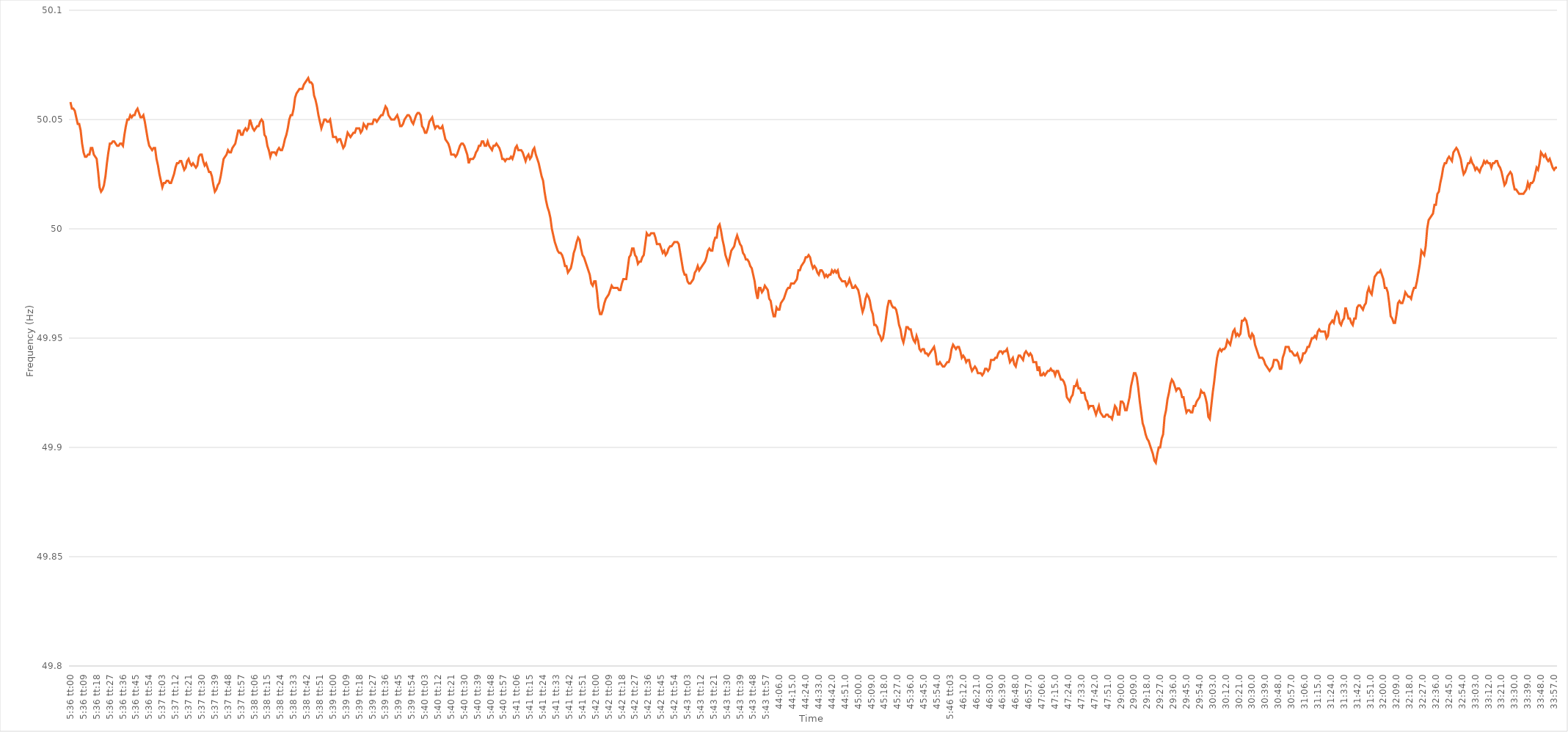
| Category | Series 0 |
|---|---|
| 0.2333333333333333 | 50.058 |
| 0.2333449074074074 | 50.055 |
| 0.23335648148148147 | 50.055 |
| 0.23336805555555554 | 50.054 |
| 0.23337962962962963 | 50.051 |
| 0.2333912037037037 | 50.048 |
| 0.23340277777777776 | 50.048 |
| 0.23341435185185186 | 50.045 |
| 0.23342592592592593 | 50.039 |
| 0.2334375 | 50.035 |
| 0.2334490740740741 | 50.033 |
| 0.23346064814814815 | 50.033 |
| 0.23347222222222222 | 50.034 |
| 0.23348379629629631 | 50.034 |
| 0.23349537037037038 | 50.037 |
| 0.23350694444444445 | 50.037 |
| 0.23351851851851854 | 50.034 |
| 0.23353009259259258 | 50.033 |
| 0.23354166666666668 | 50.032 |
| 0.23355324074074071 | 50.026 |
| 0.23356481481481484 | 50.019 |
| 0.23357638888888888 | 50.017 |
| 0.23358796296296294 | 50.018 |
| 0.23359953703703704 | 50.02 |
| 0.2336111111111111 | 50.024 |
| 0.23362268518518517 | 50.03 |
| 0.23363425925925926 | 50.035 |
| 0.23364583333333333 | 50.039 |
| 0.2336574074074074 | 50.039 |
| 0.2336689814814815 | 50.04 |
| 0.23368055555555556 | 50.04 |
| 0.23369212962962962 | 50.039 |
| 0.23370370370370372 | 50.038 |
| 0.23371527777777779 | 50.038 |
| 0.23372685185185185 | 50.039 |
| 0.23373842592592595 | 50.039 |
| 0.23375 | 50.038 |
| 0.23376157407407408 | 50.043 |
| 0.23377314814814812 | 50.047 |
| 0.23378472222222224 | 50.05 |
| 0.23379629629629628 | 50.05 |
| 0.23380787037037035 | 50.052 |
| 0.23381944444444444 | 50.051 |
| 0.2338310185185185 | 50.052 |
| 0.23384259259259257 | 50.052 |
| 0.23385416666666667 | 50.054 |
| 0.23386574074074074 | 50.055 |
| 0.2338773148148148 | 50.053 |
| 0.2338888888888889 | 50.051 |
| 0.23390046296296296 | 50.051 |
| 0.23391203703703703 | 50.052 |
| 0.23392361111111112 | 50.049 |
| 0.2339351851851852 | 50.045 |
| 0.23394675925925926 | 50.041 |
| 0.23395833333333335 | 50.038 |
| 0.23396990740740742 | 50.037 |
| 0.23398148148148148 | 50.036 |
| 0.23399305555555558 | 50.037 |
| 0.23400462962962965 | 50.037 |
| 0.23401620370370368 | 50.032 |
| 0.2340277777777778 | 50.029 |
| 0.23403935185185185 | 50.025 |
| 0.2340509259259259 | 50.022 |
| 0.23406249999999998 | 50.019 |
| 0.23407407407407407 | 50.021 |
| 0.23408564814814814 | 50.021 |
| 0.2340972222222222 | 50.022 |
| 0.2341087962962963 | 50.022 |
| 0.23412037037037037 | 50.021 |
| 0.23413194444444443 | 50.021 |
| 0.23414351851851853 | 50.023 |
| 0.2341550925925926 | 50.025 |
| 0.23416666666666666 | 50.028 |
| 0.23417824074074076 | 50.03 |
| 0.23418981481481482 | 50.03 |
| 0.2342013888888889 | 50.031 |
| 0.23421296296296298 | 50.031 |
| 0.23422453703703705 | 50.029 |
| 0.2342361111111111 | 50.027 |
| 0.2342476851851852 | 50.028 |
| 0.23425925925925925 | 50.031 |
| 0.23427083333333334 | 50.032 |
| 0.23428240740740738 | 50.03 |
| 0.23429398148148148 | 50.029 |
| 0.23430555555555554 | 50.03 |
| 0.2343171296296296 | 50.029 |
| 0.2343287037037037 | 50.028 |
| 0.23434027777777777 | 50.029 |
| 0.23435185185185184 | 50.033 |
| 0.23436342592592593 | 50.034 |
| 0.234375 | 50.034 |
| 0.23438657407407407 | 50.031 |
| 0.23439814814814816 | 50.029 |
| 0.23440972222222223 | 50.03 |
| 0.2344212962962963 | 50.028 |
| 0.2344328703703704 | 50.026 |
| 0.23444444444444446 | 50.026 |
| 0.23445601851851852 | 50.024 |
| 0.23446759259259262 | 50.02 |
| 0.23447916666666666 | 50.017 |
| 0.23449074074074075 | 50.018 |
| 0.2345023148148148 | 50.02 |
| 0.2345138888888889 | 50.021 |
| 0.23452546296296295 | 50.024 |
| 0.23453703703703702 | 50.028 |
| 0.2345486111111111 | 50.032 |
| 0.23456018518518518 | 50.033 |
| 0.23457175925925924 | 50.034 |
| 0.23458333333333334 | 50.036 |
| 0.2345949074074074 | 50.035 |
| 0.23460648148148147 | 50.035 |
| 0.23461805555555557 | 50.037 |
| 0.23462962962962963 | 50.038 |
| 0.2346412037037037 | 50.039 |
| 0.2346527777777778 | 50.042 |
| 0.23466435185185186 | 50.045 |
| 0.23467592592592593 | 50.045 |
| 0.23468750000000002 | 50.043 |
| 0.2346990740740741 | 50.043 |
| 0.23471064814814815 | 50.045 |
| 0.2347222222222222 | 50.046 |
| 0.23473379629629632 | 50.045 |
| 0.23474537037037035 | 50.046 |
| 0.23475694444444442 | 50.05 |
| 0.23476851851851852 | 50.048 |
| 0.23478009259259258 | 50.046 |
| 0.23479166666666665 | 50.045 |
| 0.23480324074074074 | 50.046 |
| 0.2348148148148148 | 50.047 |
| 0.23482638888888888 | 50.047 |
| 0.23483796296296297 | 50.049 |
| 0.23484953703703704 | 50.05 |
| 0.2348611111111111 | 50.049 |
| 0.2348726851851852 | 50.043 |
| 0.23488425925925926 | 50.042 |
| 0.23489583333333333 | 50.038 |
| 0.23490740740740743 | 50.036 |
| 0.2349189814814815 | 50.033 |
| 0.23493055555555556 | 50.035 |
| 0.23494212962962965 | 50.035 |
| 0.23495370370370372 | 50.035 |
| 0.23496527777777776 | 50.034 |
| 0.23497685185185188 | 50.036 |
| 0.23498842592592592 | 50.037 |
| 0.235 | 50.036 |
| 0.23501157407407405 | 50.036 |
| 0.23502314814814815 | 50.038 |
| 0.23503472222222221 | 50.041 |
| 0.23504629629629628 | 50.043 |
| 0.23505787037037038 | 50.046 |
| 0.23506944444444444 | 50.05 |
| 0.2350810185185185 | 50.052 |
| 0.2350925925925926 | 50.052 |
| 0.23510416666666667 | 50.055 |
| 0.23511574074074074 | 50.06 |
| 0.23512731481481483 | 50.062 |
| 0.2351388888888889 | 50.063 |
| 0.23515046296296296 | 50.064 |
| 0.23516203703703706 | 50.064 |
| 0.23517361111111112 | 50.064 |
| 0.23518518518518516 | 50.066 |
| 0.23519675925925929 | 50.067 |
| 0.23520833333333332 | 50.068 |
| 0.23521990740740742 | 50.069 |
| 0.23523148148148146 | 50.067 |
| 0.23524305555555555 | 50.067 |
| 0.23525462962962962 | 50.066 |
| 0.23526620370370369 | 50.061 |
| 0.23527777777777778 | 50.059 |
| 0.23528935185185185 | 50.056 |
| 0.2353009259259259 | 50.052 |
| 0.2353125 | 50.049 |
| 0.23532407407407407 | 50.046 |
| 0.23533564814814814 | 50.048 |
| 0.23534722222222224 | 50.05 |
| 0.2353587962962963 | 50.05 |
| 0.23537037037037037 | 50.049 |
| 0.23538194444444446 | 50.049 |
| 0.23539351851851853 | 50.05 |
| 0.2354050925925926 | 50.046 |
| 0.2354166666666667 | 50.042 |
| 0.23542824074074073 | 50.042 |
| 0.23543981481481482 | 50.042 |
| 0.23545138888888886 | 50.04 |
| 0.23546296296296299 | 50.041 |
| 0.23547453703703702 | 50.041 |
| 0.2354861111111111 | 50.039 |
| 0.23549768518518518 | 50.037 |
| 0.23550925925925925 | 50.038 |
| 0.23552083333333332 | 50.041 |
| 0.2355324074074074 | 50.044 |
| 0.23554398148148148 | 50.043 |
| 0.23555555555555555 | 50.042 |
| 0.23556712962962964 | 50.043 |
| 0.2355787037037037 | 50.044 |
| 0.23559027777777777 | 50.044 |
| 0.23560185185185187 | 50.046 |
| 0.23561342592592593 | 50.046 |
| 0.235625 | 50.046 |
| 0.2356365740740741 | 50.044 |
| 0.23564814814814816 | 50.045 |
| 0.23565972222222223 | 50.048 |
| 0.23567129629629627 | 50.047 |
| 0.2356828703703704 | 50.046 |
| 0.23569444444444443 | 50.048 |
| 0.2357060185185185 | 50.048 |
| 0.2357175925925926 | 50.048 |
| 0.23572916666666666 | 50.048 |
| 0.23574074074074072 | 50.05 |
| 0.23575231481481482 | 50.05 |
| 0.23576388888888888 | 50.049 |
| 0.23577546296296295 | 50.05 |
| 0.23578703703703704 | 50.051 |
| 0.2357986111111111 | 50.052 |
| 0.23581018518518518 | 50.052 |
| 0.23582175925925927 | 50.054 |
| 0.23583333333333334 | 50.056 |
| 0.2358449074074074 | 50.055 |
| 0.2358564814814815 | 50.052 |
| 0.23586805555555557 | 50.051 |
| 0.23587962962962963 | 50.05 |
| 0.23589120370370367 | 50.05 |
| 0.2359027777777778 | 50.05 |
| 0.23591435185185183 | 50.051 |
| 0.23592592592592596 | 50.052 |
| 0.2359375 | 50.05 |
| 0.23594907407407406 | 50.047 |
| 0.23596064814814813 | 50.047 |
| 0.23597222222222222 | 50.048 |
| 0.2359837962962963 | 50.05 |
| 0.23599537037037036 | 50.051 |
| 0.23600694444444445 | 50.052 |
| 0.23601851851851852 | 50.052 |
| 0.23603009259259258 | 50.051 |
| 0.23604166666666668 | 50.049 |
| 0.23605324074074074 | 50.048 |
| 0.2360648148148148 | 50.05 |
| 0.2360763888888889 | 50.052 |
| 0.23608796296296297 | 50.053 |
| 0.23609953703703704 | 50.053 |
| 0.23611111111111113 | 50.052 |
| 0.2361226851851852 | 50.047 |
| 0.23613425925925924 | 50.046 |
| 0.23614583333333336 | 50.044 |
| 0.2361574074074074 | 50.044 |
| 0.2361689814814815 | 50.046 |
| 0.23618055555555553 | 50.049 |
| 0.23619212962962963 | 50.05 |
| 0.2362037037037037 | 50.051 |
| 0.23621527777777776 | 50.048 |
| 0.23622685185185185 | 50.046 |
| 0.23623842592592592 | 50.047 |
| 0.23625 | 50.047 |
| 0.23626157407407408 | 50.046 |
| 0.23627314814814815 | 50.046 |
| 0.23628472222222222 | 50.047 |
| 0.2362962962962963 | 50.044 |
| 0.23630787037037038 | 50.041 |
| 0.23631944444444444 | 50.04 |
| 0.23633101851851854 | 50.039 |
| 0.2363425925925926 | 50.037 |
| 0.23635416666666667 | 50.034 |
| 0.23636574074074077 | 50.034 |
| 0.2363773148148148 | 50.034 |
| 0.2363888888888889 | 50.033 |
| 0.23640046296296294 | 50.034 |
| 0.23641203703703703 | 50.036 |
| 0.2364236111111111 | 50.038 |
| 0.23643518518518516 | 50.039 |
| 0.23644675925925926 | 50.039 |
| 0.23645833333333333 | 50.038 |
| 0.2364699074074074 | 50.036 |
| 0.2364814814814815 | 50.034 |
| 0.23649305555555555 | 50.03 |
| 0.23650462962962962 | 50.032 |
| 0.23651620370370371 | 50.032 |
| 0.23652777777777778 | 50.032 |
| 0.23653935185185185 | 50.033 |
| 0.23655092592592594 | 50.035 |
| 0.2365625 | 50.036 |
| 0.23657407407407408 | 50.038 |
| 0.23658564814814817 | 50.038 |
| 0.23659722222222224 | 50.04 |
| 0.2366087962962963 | 50.04 |
| 0.23662037037037034 | 50.038 |
| 0.23663194444444446 | 50.038 |
| 0.2366435185185185 | 50.04 |
| 0.23665509259259257 | 50.038 |
| 0.23666666666666666 | 50.037 |
| 0.23667824074074073 | 50.036 |
| 0.2366898148148148 | 50.038 |
| 0.2367013888888889 | 50.038 |
| 0.23671296296296296 | 50.039 |
| 0.23672453703703702 | 50.038 |
| 0.23673611111111112 | 50.037 |
| 0.23674768518518519 | 50.035 |
| 0.23675925925925925 | 50.032 |
| 0.23677083333333335 | 50.032 |
| 0.2367824074074074 | 50.031 |
| 0.23679398148148148 | 50.032 |
| 0.23680555555555557 | 50.032 |
| 0.23681712962962964 | 50.032 |
| 0.2368287037037037 | 50.033 |
| 0.23684027777777775 | 50.032 |
| 0.23685185185185187 | 50.034 |
| 0.2368634259259259 | 50.037 |
| 0.23687500000000003 | 50.038 |
| 0.23688657407407407 | 50.036 |
| 0.23689814814814814 | 50.036 |
| 0.2369097222222222 | 50.036 |
| 0.2369212962962963 | 50.035 |
| 0.23693287037037036 | 50.033 |
| 0.23694444444444443 | 50.031 |
| 0.23695601851851852 | 50.033 |
| 0.2369675925925926 | 50.034 |
| 0.23697916666666666 | 50.032 |
| 0.23699074074074075 | 50.033 |
| 0.23700231481481482 | 50.036 |
| 0.23701388888888889 | 50.037 |
| 0.23702546296296298 | 50.034 |
| 0.23703703703703705 | 50.032 |
| 0.2370486111111111 | 50.03 |
| 0.2370601851851852 | 50.027 |
| 0.23707175925925927 | 50.024 |
| 0.2370833333333333 | 50.022 |
| 0.23709490740740743 | 50.017 |
| 0.23710648148148147 | 50.013 |
| 0.23711805555555557 | 50.01 |
| 0.2371296296296296 | 50.008 |
| 0.2371412037037037 | 50.005 |
| 0.23715277777777777 | 50 |
| 0.23716435185185183 | 49.997 |
| 0.23717592592592593 | 49.994 |
| 0.2371875 | 49.992 |
| 0.23719907407407406 | 49.99 |
| 0.23721064814814816 | 49.989 |
| 0.23722222222222222 | 49.989 |
| 0.2372337962962963 | 49.988 |
| 0.23724537037037038 | 49.986 |
| 0.23725694444444445 | 49.983 |
| 0.23726851851851852 | 49.983 |
| 0.2372800925925926 | 49.98 |
| 0.23729166666666668 | 49.981 |
| 0.23730324074074075 | 49.982 |
| 0.23731481481481484 | 49.985 |
| 0.23732638888888888 | 49.989 |
| 0.23733796296296297 | 49.991 |
| 0.237349537037037 | 49.994 |
| 0.2373611111111111 | 49.996 |
| 0.23737268518518517 | 49.995 |
| 0.23738425925925924 | 49.991 |
| 0.23739583333333333 | 49.988 |
| 0.2374074074074074 | 49.987 |
| 0.23741898148148147 | 49.985 |
| 0.23743055555555556 | 49.983 |
| 0.23744212962962963 | 49.981 |
| 0.2374537037037037 | 49.979 |
| 0.2374652777777778 | 49.975 |
| 0.23747685185185186 | 49.974 |
| 0.23748842592592592 | 49.976 |
| 0.23750000000000002 | 49.976 |
| 0.23751157407407408 | 49.971 |
| 0.23752314814814815 | 49.964 |
| 0.23753472222222224 | 49.961 |
| 0.2375462962962963 | 49.961 |
| 0.23755787037037038 | 49.963 |
| 0.23756944444444442 | 49.966 |
| 0.23758101851851854 | 49.968 |
| 0.23759259259259258 | 49.969 |
| 0.23760416666666664 | 49.97 |
| 0.23761574074074074 | 49.972 |
| 0.2376273148148148 | 49.974 |
| 0.23763888888888887 | 49.973 |
| 0.23765046296296297 | 49.973 |
| 0.23766203703703703 | 49.973 |
| 0.2376736111111111 | 49.973 |
| 0.2376851851851852 | 49.972 |
| 0.23769675925925926 | 49.972 |
| 0.23770833333333333 | 49.975 |
| 0.23771990740740742 | 49.977 |
| 0.2377314814814815 | 49.977 |
| 0.23774305555555555 | 49.977 |
| 0.23775462962962965 | 49.982 |
| 0.23776620370370372 | 49.987 |
| 0.23777777777777778 | 49.988 |
| 0.23778935185185182 | 49.991 |
| 0.23780092592592594 | 49.991 |
| 0.23781249999999998 | 49.988 |
| 0.2378240740740741 | 49.987 |
| 0.23783564814814814 | 49.984 |
| 0.2378472222222222 | 49.985 |
| 0.23785879629629628 | 49.985 |
| 0.23787037037037037 | 49.987 |
| 0.23788194444444444 | 49.988 |
| 0.2378935185185185 | 49.993 |
| 0.2379050925925926 | 49.998 |
| 0.23791666666666667 | 49.997 |
| 0.23792824074074073 | 49.997 |
| 0.23793981481481483 | 49.998 |
| 0.2379513888888889 | 49.998 |
| 0.23796296296296296 | 49.998 |
| 0.23797453703703705 | 49.996 |
| 0.23798611111111112 | 49.993 |
| 0.2379976851851852 | 49.993 |
| 0.23800925925925928 | 49.993 |
| 0.23802083333333335 | 49.991 |
| 0.2380324074074074 | 49.989 |
| 0.2380439814814815 | 49.99 |
| 0.23805555555555555 | 49.988 |
| 0.23806712962962964 | 49.989 |
| 0.23807870370370368 | 49.991 |
| 0.23809027777777778 | 49.992 |
| 0.23810185185185184 | 49.992 |
| 0.2381134259259259 | 49.993 |
| 0.238125 | 49.994 |
| 0.23813657407407407 | 49.994 |
| 0.23814814814814814 | 49.994 |
| 0.23815972222222223 | 49.993 |
| 0.2381712962962963 | 49.989 |
| 0.23818287037037036 | 49.985 |
| 0.23819444444444446 | 49.981 |
| 0.23820601851851853 | 49.979 |
| 0.2382175925925926 | 49.979 |
| 0.2382291666666667 | 49.976 |
| 0.23824074074074075 | 49.975 |
| 0.23825231481481482 | 49.975 |
| 0.23826388888888891 | 49.976 |
| 0.23827546296296295 | 49.977 |
| 0.23828703703703705 | 49.98 |
| 0.23829861111111109 | 49.981 |
| 0.23831018518518518 | 49.983 |
| 0.23832175925925925 | 49.981 |
| 0.2383333333333333 | 49.982 |
| 0.2383449074074074 | 49.983 |
| 0.23835648148148147 | 49.984 |
| 0.23836805555555554 | 49.985 |
| 0.23837962962962964 | 49.987 |
| 0.2383912037037037 | 49.99 |
| 0.23840277777777777 | 49.991 |
| 0.23841435185185186 | 49.99 |
| 0.23842592592592593 | 49.99 |
| 0.2384375 | 49.994 |
| 0.2384490740740741 | 49.996 |
| 0.23846064814814816 | 49.996 |
| 0.23847222222222222 | 50.001 |
| 0.23848379629629632 | 50.002 |
| 0.23849537037037036 | 49.999 |
| 0.23850694444444445 | 49.995 |
| 0.2385185185185185 | 49.992 |
| 0.2385300925925926 | 49.988 |
| 0.23854166666666665 | 49.986 |
| 0.23855324074074072 | 49.984 |
| 0.2385648148148148 | 49.987 |
| 0.23857638888888888 | 49.99 |
| 0.23858796296296295 | 49.991 |
| 0.23859953703703704 | 49.992 |
| 0.2386111111111111 | 49.995 |
| 0.23862268518518517 | 49.997 |
| 0.23863425925925927 | 49.995 |
| 0.23864583333333333 | 49.993 |
| 0.2386574074074074 | 49.992 |
| 0.2386689814814815 | 49.989 |
| 0.23868055555555556 | 49.988 |
| 0.23869212962962963 | 49.986 |
| 0.23870370370370372 | 49.986 |
| 0.2387152777777778 | 49.985 |
| 0.23872685185185186 | 49.983 |
| 0.2387384259259259 | 49.982 |
| 0.23875000000000002 | 49.979 |
| 0.23876157407407406 | 49.976 |
| 0.23877314814814818 | 49.971 |
| 0.23878472222222222 | 49.968 |
| 0.23879629629629628 | 49.973 |
| 0.23880787037037035 | 49.973 |
| 0.23881944444444445 | 49.971 |
| 0.2388310185185185 | 49.972 |
| 0.23884259259259258 | 49.974 |
| 0.23885416666666667 | 49.973 |
| 0.23886574074074074 | 49.972 |
| 0.2388773148148148 | 49.968 |
| 0.2388888888888889 | 49.967 |
| 0.23890046296296297 | 49.963 |
| 0.23891203703703703 | 49.96 |
| 0.23892361111111113 | 49.96 |
| 0.2389351851851852 | 49.964 |
| 0.23894675925925926 | 49.963 |
| 0.23895833333333336 | 49.963 |
| 0.23896990740740742 | 49.966 |
| 0.23898148148148146 | 49.967 |
| 0.23899305555555558 | 49.968 |
| 0.23900462962962962 | 49.97 |
| 0.2390162037037037 | 49.972 |
| 0.23902777777777776 | 49.973 |
| 0.23903935185185185 | 49.973 |
| 0.23905092592592592 | 49.975 |
| 0.23906249999999998 | 49.975 |
| 0.23907407407407408 | 49.975 |
| 0.23908564814814814 | 49.976 |
| 0.2390972222222222 | 49.977 |
| 0.2391087962962963 | 49.981 |
| 0.23912037037037037 | 49.981 |
| 0.23913194444444444 | 49.983 |
| 0.23914351851851853 | 49.984 |
| 0.2391550925925926 | 49.985 |
| 0.23916666666666667 | 49.987 |
| 0.23917824074074076 | 49.987 |
| 0.23918981481481483 | 49.988 |
| 0.2392013888888889 | 49.987 |
| 0.239212962962963 | 49.984 |
| 0.23922453703703703 | 49.982 |
| 0.23923611111111112 | 49.983 |
| 0.23924768518518516 | 49.982 |
| 0.23925925925925925 | 49.98 |
| 0.23927083333333332 | 49.979 |
| 0.2392824074074074 | 49.981 |
| 0.23929398148148148 | 49.981 |
| 0.23930555555555555 | 49.98 |
| 0.23931712962962962 | 49.978 |
| 0.2393287037037037 | 49.979 |
| 0.23934027777777778 | 49.978 |
| 0.23935185185185184 | 49.979 |
| 0.23936342592592594 | 49.979 |
| 0.239375 | 49.981 |
| 0.23938657407407407 | 49.98 |
| 0.23939814814814817 | 49.981 |
| 0.23940972222222223 | 49.98 |
| 0.2394212962962963 | 49.981 |
| 0.2394328703703704 | 49.978 |
| 0.23944444444444443 | 49.977 |
| 0.23945601851851853 | 49.976 |
| 0.23946759259259257 | 49.976 |
| 0.2394791666666667 | 49.976 |
| 0.23949074074074073 | 49.974 |
| 0.2395023148148148 | 49.975 |
| 0.2395138888888889 | 49.977 |
| 0.23952546296296295 | 49.975 |
| 0.23953703703703702 | 49.973 |
| 0.23954861111111111 | 49.973 |
| 0.23956018518518518 | 49.974 |
| 0.23957175925925925 | 49.973 |
| 0.23958333333333334 | 49.972 |
| 0.2395949074074074 | 49.969 |
| 0.23960648148148148 | 49.965 |
| 0.23961805555555557 | 49.962 |
| 0.23962962962962964 | 49.964 |
| 0.2396412037037037 | 49.968 |
| 0.2396527777777778 | 49.97 |
| 0.23966435185185186 | 49.969 |
| 0.23967592592592593 | 49.967 |
| 0.23968749999999997 | 49.963 |
| 0.2396990740740741 | 49.961 |
| 0.23971064814814813 | 49.956 |
| 0.23972222222222225 | 49.956 |
| 0.2397337962962963 | 49.955 |
| 0.23974537037037036 | 49.952 |
| 0.23975694444444443 | 49.951 |
| 0.23976851851851852 | 49.949 |
| 0.2397800925925926 | 49.95 |
| 0.23979166666666665 | 49.954 |
| 0.23980324074074075 | 49.959 |
| 0.23981481481481481 | 49.964 |
| 0.23982638888888888 | 49.967 |
| 0.23983796296296298 | 49.967 |
| 0.23984953703703704 | 49.965 |
| 0.2398611111111111 | 49.964 |
| 0.2398726851851852 | 49.964 |
| 0.23988425925925927 | 49.963 |
| 0.23989583333333334 | 49.96 |
| 0.23990740740740743 | 49.956 |
| 0.2399189814814815 | 49.954 |
| 0.23993055555555554 | 49.95 |
| 0.23994212962962966 | 49.948 |
| 0.2399537037037037 | 49.951 |
| 0.23996527777777776 | 49.955 |
| 0.23997685185185183 | 49.955 |
| 0.23998842592592592 | 49.954 |
| 0.24 | 49.954 |
| 0.24001157407407406 | 49.951 |
| 0.24002314814814815 | 49.949 |
| 0.24003472222222222 | 49.948 |
| 0.24004629629629629 | 49.951 |
| 0.24005787037037038 | 49.949 |
| 0.24006944444444445 | 49.945 |
| 0.2400810185185185 | 49.944 |
| 0.2400925925925926 | 49.945 |
| 0.24010416666666667 | 49.945 |
| 0.24011574074074074 | 49.943 |
| 0.24012731481481484 | 49.943 |
| 0.2401388888888889 | 49.942 |
| 0.24015046296296297 | 49.943 |
| 0.24016203703703706 | 49.944 |
| 0.2401736111111111 | 49.945 |
| 0.2401851851851852 | 49.946 |
| 0.24019675925925923 | 49.943 |
| 0.24020833333333333 | 49.938 |
| 0.2402199074074074 | 49.938 |
| 0.24023148148148146 | 49.939 |
| 0.24024305555555556 | 49.938 |
| 0.24025462962962962 | 49.937 |
| 0.2402662037037037 | 49.937 |
| 0.24027777777777778 | 49.938 |
| 0.24028935185185185 | 49.939 |
| 0.24030092592592592 | 49.939 |
| 0.2403125 | 49.941 |
| 0.24032407407407408 | 49.945 |
| 0.24033564814814815 | 49.947 |
| 0.24034722222222224 | 49.946 |
| 0.2403587962962963 | 49.945 |
| 0.24037037037037037 | 49.946 |
| 0.24038194444444447 | 49.946 |
| 0.2403935185185185 | 49.944 |
| 0.2404050925925926 | 49.941 |
| 0.24041666666666664 | 49.942 |
| 0.24042824074074076 | 49.941 |
| 0.2404398148148148 | 49.939 |
| 0.24045138888888887 | 49.94 |
| 0.24046296296296296 | 49.94 |
| 0.24047453703703703 | 49.937 |
| 0.2404861111111111 | 49.935 |
| 0.2404976851851852 | 49.936 |
| 0.24050925925925926 | 49.937 |
| 0.24052083333333332 | 49.936 |
| 0.24053240740740742 | 49.934 |
| 0.24054398148148148 | 49.934 |
| 0.24055555555555555 | 49.934 |
| 0.24056712962962964 | 49.933 |
| 0.2405787037037037 | 49.934 |
| 0.24059027777777778 | 49.936 |
| 0.24060185185185187 | 49.936 |
| 0.24061342592592594 | 49.935 |
| 0.240625 | 49.936 |
| 0.24063657407407404 | 49.94 |
| 0.24064814814814817 | 49.94 |
| 0.2406597222222222 | 49.94 |
| 0.24067129629629633 | 49.941 |
| 0.24068287037037037 | 49.941 |
| 0.24069444444444443 | 49.943 |
| 0.2407060185185185 | 49.944 |
| 0.2407175925925926 | 49.944 |
| 0.24072916666666666 | 49.943 |
| 0.24074074074074073 | 49.944 |
| 0.24075231481481482 | 49.944 |
| 0.2407638888888889 | 49.945 |
| 0.24077546296296296 | 49.942 |
| 0.24078703703703705 | 49.939 |
| 0.24079861111111112 | 49.94 |
| 0.24081018518518518 | 49.941 |
| 0.24082175925925928 | 49.938 |
| 0.24083333333333334 | 49.937 |
| 0.2408449074074074 | 49.94 |
| 0.2408564814814815 | 49.942 |
| 0.24086805555555557 | 49.942 |
| 0.2408796296296296 | 49.941 |
| 0.24089120370370373 | 49.94 |
| 0.24090277777777777 | 49.943 |
| 0.24091435185185184 | 49.944 |
| 0.2409259259259259 | 49.943 |
| 0.2409375 | 49.942 |
| 0.24094907407407407 | 49.943 |
| 0.24096064814814813 | 49.942 |
| 0.24097222222222223 | 49.939 |
| 0.2409837962962963 | 49.939 |
| 0.24099537037037036 | 49.939 |
| 0.24100694444444445 | 49.935 |
| 0.24101851851851852 | 49.937 |
| 0.2410300925925926 | 49.933 |
| 0.24104166666666668 | 49.933 |
| 0.24105324074074075 | 49.934 |
| 0.24106481481481482 | 49.933 |
| 0.2410763888888889 | 49.934 |
| 0.24108796296296298 | 49.935 |
| 0.24109953703703701 | 49.935 |
| 0.24111111111111114 | 49.936 |
| 0.24112268518518518 | 49.935 |
| 0.24113425925925927 | 49.935 |
| 0.2411458333333333 | 49.933 |
| 0.2411574074074074 | 49.935 |
| 0.24116898148148147 | 49.935 |
| 0.24118055555555554 | 49.933 |
| 0.24119212962962963 | 49.931 |
| 0.2412037037037037 | 49.931 |
| 0.24121527777777776 | 49.93 |
| 0.24122685185185186 | 49.928 |
| 0.24123842592592593 | 49.923 |
| 0.24125 | 49.922 |
| 0.2412615740740741 | 49.921 |
| 0.24127314814814815 | 49.923 |
| 0.24128472222222222 | 49.924 |
| 0.24129629629629631 | 49.928 |
| 0.24130787037037038 | 49.928 |
| 0.24131944444444445 | 49.93 |
| 0.24133101851851854 | 49.927 |
| 0.24134259259259258 | 49.927 |
| 0.24135416666666668 | 49.925 |
| 0.24136574074074071 | 49.925 |
| 0.24137731481481484 | 49.925 |
| 0.24138888888888888 | 49.922 |
| 0.24140046296296294 | 49.921 |
| 0.24141203703703704 | 49.918 |
| 0.2414236111111111 | 49.919 |
| 0.24143518518518517 | 49.919 |
| 0.24144675925925926 | 49.919 |
| 0.24145833333333333 | 49.917 |
| 0.2414699074074074 | 49.915 |
| 0.2414814814814815 | 49.917 |
| 0.24149305555555556 | 49.919 |
| 0.24150462962962962 | 49.916 |
| 0.24151620370370372 | 49.915 |
| 0.24152777777777779 | 49.914 |
| 0.24153935185185185 | 49.914 |
| 0.24155092592592595 | 49.915 |
| 0.2415625 | 49.915 |
| 0.24157407407407408 | 49.914 |
| 0.24158564814814812 | 49.914 |
| 0.24159722222222224 | 49.913 |
| 0.24160879629629628 | 49.916 |
| 0.24162037037037035 | 49.919 |
| 0.24163194444444444 | 49.918 |
| 0.2416435185185185 | 49.915 |
| 0.24165509259259257 | 49.915 |
| 0.2701388888888889 | 49.921 |
| 0.27015046296296297 | 49.921 |
| 0.27016203703703706 | 49.92 |
| 0.2701736111111111 | 49.917 |
| 0.2701851851851852 | 49.917 |
| 0.2701967592592593 | 49.92 |
| 0.27020833333333333 | 49.923 |
| 0.2702199074074074 | 49.928 |
| 0.2702314814814815 | 49.931 |
| 0.27024305555555556 | 49.934 |
| 0.2702546296296296 | 49.934 |
| 0.2702662037037037 | 49.932 |
| 0.2702777777777778 | 49.927 |
| 0.2702893518518518 | 49.921 |
| 0.2703009259259259 | 49.916 |
| 0.2703125 | 49.911 |
| 0.27032407407407405 | 49.909 |
| 0.27033564814814814 | 49.906 |
| 0.27034722222222224 | 49.904 |
| 0.2703587962962963 | 49.903 |
| 0.27037037037037037 | 49.901 |
| 0.27038194444444447 | 49.899 |
| 0.2703935185185185 | 49.897 |
| 0.2704050925925926 | 49.894 |
| 0.2704166666666667 | 49.893 |
| 0.27042824074074073 | 49.897 |
| 0.2704398148148148 | 49.9 |
| 0.2704513888888889 | 49.9 |
| 0.27046296296296296 | 49.904 |
| 0.27047453703703705 | 49.906 |
| 0.2704861111111111 | 49.914 |
| 0.2704976851851852 | 49.917 |
| 0.2705092592592592 | 49.922 |
| 0.2705208333333333 | 49.925 |
| 0.2705324074074074 | 49.929 |
| 0.27054398148148145 | 49.931 |
| 0.27055555555555555 | 49.93 |
| 0.27056712962962964 | 49.928 |
| 0.2705787037037037 | 49.926 |
| 0.2705902777777778 | 49.927 |
| 0.27060185185185187 | 49.927 |
| 0.2706134259259259 | 49.926 |
| 0.270625 | 49.923 |
| 0.2706365740740741 | 49.923 |
| 0.27064814814814814 | 49.919 |
| 0.27065972222222223 | 49.916 |
| 0.2706712962962963 | 49.917 |
| 0.27068287037037037 | 49.917 |
| 0.27069444444444446 | 49.916 |
| 0.27070601851851855 | 49.916 |
| 0.2707175925925926 | 49.919 |
| 0.27072916666666663 | 49.919 |
| 0.2707407407407407 | 49.921 |
| 0.2707523148148148 | 49.922 |
| 0.27076388888888886 | 49.923 |
| 0.27077546296296295 | 49.926 |
| 0.27078703703703705 | 49.925 |
| 0.2707986111111111 | 49.925 |
| 0.2708101851851852 | 49.923 |
| 0.2708217592592593 | 49.92 |
| 0.2708333333333333 | 49.914 |
| 0.2708449074074074 | 49.913 |
| 0.2708564814814815 | 49.919 |
| 0.27086805555555554 | 49.925 |
| 0.27087962962962964 | 49.93 |
| 0.27089120370370373 | 49.936 |
| 0.27090277777777777 | 49.941 |
| 0.27091435185185186 | 49.944 |
| 0.27092592592592596 | 49.945 |
| 0.2709375 | 49.944 |
| 0.2709490740740741 | 49.945 |
| 0.27096064814814813 | 49.945 |
| 0.2709722222222222 | 49.946 |
| 0.27098379629629626 | 49.949 |
| 0.27099537037037036 | 49.948 |
| 0.27100694444444445 | 49.947 |
| 0.2710185185185185 | 49.95 |
| 0.2710300925925926 | 49.953 |
| 0.2710416666666667 | 49.954 |
| 0.2710532407407407 | 49.951 |
| 0.2710648148148148 | 49.952 |
| 0.2710763888888889 | 49.951 |
| 0.27108796296296295 | 49.952 |
| 0.27109953703703704 | 49.958 |
| 0.27111111111111114 | 49.958 |
| 0.2711226851851852 | 49.959 |
| 0.27113425925925927 | 49.958 |
| 0.27114583333333336 | 49.955 |
| 0.2711574074074074 | 49.951 |
| 0.2711689814814815 | 49.95 |
| 0.27118055555555554 | 49.952 |
| 0.27119212962962963 | 49.951 |
| 0.27120370370370367 | 49.947 |
| 0.27121527777777776 | 49.945 |
| 0.27122685185185186 | 49.943 |
| 0.2712384259259259 | 49.941 |
| 0.27125 | 49.941 |
| 0.2712615740740741 | 49.941 |
| 0.2712731481481481 | 49.94 |
| 0.2712847222222222 | 49.938 |
| 0.2712962962962963 | 49.937 |
| 0.27130787037037035 | 49.936 |
| 0.27131944444444445 | 49.935 |
| 0.27133101851851854 | 49.936 |
| 0.2713425925925926 | 49.937 |
| 0.2713541666666667 | 49.94 |
| 0.27136574074074077 | 49.94 |
| 0.2713773148148148 | 49.94 |
| 0.2713888888888889 | 49.939 |
| 0.271400462962963 | 49.936 |
| 0.27141203703703703 | 49.936 |
| 0.2714236111111111 | 49.941 |
| 0.2714351851851852 | 49.943 |
| 0.27144675925925926 | 49.946 |
| 0.2714583333333333 | 49.946 |
| 0.2714699074074074 | 49.946 |
| 0.2714814814814815 | 49.944 |
| 0.27149305555555553 | 49.944 |
| 0.2715046296296296 | 49.943 |
| 0.2715162037037037 | 49.942 |
| 0.27152777777777776 | 49.942 |
| 0.27153935185185185 | 49.943 |
| 0.27155092592592595 | 49.941 |
| 0.2715625 | 49.939 |
| 0.2715740740740741 | 49.94 |
| 0.2715856481481482 | 49.943 |
| 0.2715972222222222 | 49.943 |
| 0.2716087962962963 | 49.944 |
| 0.2716203703703704 | 49.946 |
| 0.27163194444444444 | 49.946 |
| 0.27164351851851853 | 49.948 |
| 0.27165509259259263 | 49.95 |
| 0.27166666666666667 | 49.95 |
| 0.2716782407407407 | 49.951 |
| 0.2716898148148148 | 49.95 |
| 0.2717013888888889 | 49.953 |
| 0.27171296296296293 | 49.954 |
| 0.27172453703703703 | 49.953 |
| 0.2717361111111111 | 49.953 |
| 0.27174768518518516 | 49.953 |
| 0.27175925925925926 | 49.953 |
| 0.27177083333333335 | 49.95 |
| 0.2717824074074074 | 49.951 |
| 0.2717939814814815 | 49.956 |
| 0.2718055555555556 | 49.957 |
| 0.2718171296296296 | 49.958 |
| 0.2718287037037037 | 49.957 |
| 0.2718402777777778 | 49.96 |
| 0.27185185185185184 | 49.962 |
| 0.27186342592592594 | 49.961 |
| 0.27187500000000003 | 49.957 |
| 0.27188657407407407 | 49.956 |
| 0.27189814814814817 | 49.958 |
| 0.2719097222222222 | 49.959 |
| 0.2719212962962963 | 49.964 |
| 0.27193287037037034 | 49.962 |
| 0.27194444444444443 | 49.959 |
| 0.2719560185185185 | 49.959 |
| 0.27196759259259257 | 49.957 |
| 0.27197916666666666 | 49.956 |
| 0.27199074074074076 | 49.959 |
| 0.2720023148148148 | 49.959 |
| 0.2720138888888889 | 49.964 |
| 0.272025462962963 | 49.965 |
| 0.272037037037037 | 49.965 |
| 0.2720486111111111 | 49.964 |
| 0.2720601851851852 | 49.963 |
| 0.27207175925925925 | 49.965 |
| 0.27208333333333334 | 49.966 |
| 0.27209490740740744 | 49.971 |
| 0.2721064814814815 | 49.973 |
| 0.27211805555555557 | 49.971 |
| 0.2721296296296296 | 49.97 |
| 0.2721412037037037 | 49.974 |
| 0.27215277777777774 | 49.978 |
| 0.27216435185185184 | 49.979 |
| 0.27217592592592593 | 49.98 |
| 0.27218749999999997 | 49.98 |
| 0.27219907407407407 | 49.981 |
| 0.27221064814814816 | 49.979 |
| 0.2722222222222222 | 49.977 |
| 0.2722337962962963 | 49.973 |
| 0.2722453703703704 | 49.973 |
| 0.2722569444444444 | 49.971 |
| 0.2722685185185185 | 49.966 |
| 0.2722800925925926 | 49.96 |
| 0.27229166666666665 | 49.959 |
| 0.27230324074074075 | 49.957 |
| 0.27231481481481484 | 49.957 |
| 0.2723263888888889 | 49.961 |
| 0.272337962962963 | 49.966 |
| 0.272349537037037 | 49.967 |
| 0.2723611111111111 | 49.966 |
| 0.27237268518518515 | 49.966 |
| 0.2723842592592593 | 49.968 |
| 0.27239583333333334 | 49.971 |
| 0.2724074074074074 | 49.97 |
| 0.27241898148148147 | 49.969 |
| 0.27243055555555556 | 49.969 |
| 0.2724421296296296 | 49.968 |
| 0.2724537037037037 | 49.971 |
| 0.2724652777777778 | 49.973 |
| 0.27247685185185183 | 49.973 |
| 0.2724884259259259 | 49.976 |
| 0.2725 | 49.98 |
| 0.27251157407407406 | 49.984 |
| 0.27252314814814815 | 49.99 |
| 0.27253472222222225 | 49.989 |
| 0.2725462962962963 | 49.988 |
| 0.2725578703703704 | 49.992 |
| 0.2725694444444445 | 50 |
| 0.2725810185185185 | 50.004 |
| 0.27259259259259255 | 50.005 |
| 0.2726041666666667 | 50.006 |
| 0.27261574074074074 | 50.007 |
| 0.27262731481481484 | 50.011 |
| 0.2726388888888889 | 50.011 |
| 0.27265046296296297 | 50.016 |
| 0.272662037037037 | 50.017 |
| 0.2726736111111111 | 50.021 |
| 0.2726851851851852 | 50.024 |
| 0.27269675925925924 | 50.028 |
| 0.27270833333333333 | 50.03 |
| 0.2727199074074074 | 50.03 |
| 0.27273148148148146 | 50.032 |
| 0.27274305555555556 | 50.033 |
| 0.27275462962962965 | 50.032 |
| 0.2727662037037037 | 50.031 |
| 0.2727777777777778 | 50.035 |
| 0.2727893518518519 | 50.036 |
| 0.2728009259259259 | 50.037 |
| 0.2728125 | 50.036 |
| 0.2728240740740741 | 50.034 |
| 0.27283564814814815 | 50.032 |
| 0.27284722222222224 | 50.028 |
| 0.2728587962962963 | 50.025 |
| 0.2728703703703704 | 50.026 |
| 0.2728819444444444 | 50.028 |
| 0.2728935185185185 | 50.03 |
| 0.2729050925925926 | 50.03 |
| 0.27291666666666664 | 50.032 |
| 0.27292824074074074 | 50.03 |
| 0.27293981481481483 | 50.029 |
| 0.27295138888888887 | 50.027 |
| 0.27296296296296296 | 50.028 |
| 0.27297453703703706 | 50.027 |
| 0.2729861111111111 | 50.026 |
| 0.2729976851851852 | 50.028 |
| 0.2730092592592593 | 50.029 |
| 0.2730208333333333 | 50.031 |
| 0.2730324074074074 | 50.03 |
| 0.2730439814814815 | 50.031 |
| 0.27305555555555555 | 50.03 |
| 0.27306712962962965 | 50.03 |
| 0.2730787037037037 | 50.028 |
| 0.2730902777777778 | 50.03 |
| 0.2731018518518518 | 50.03 |
| 0.2731134259259259 | 50.031 |
| 0.273125 | 50.031 |
| 0.27313657407407405 | 50.029 |
| 0.27314814814814814 | 50.028 |
| 0.27315972222222223 | 50.026 |
| 0.2731712962962963 | 50.023 |
| 0.27318287037037037 | 50.02 |
| 0.27319444444444446 | 50.021 |
| 0.2732060185185185 | 50.024 |
| 0.2732175925925926 | 50.025 |
| 0.2732291666666667 | 50.026 |
| 0.27324074074074073 | 50.025 |
| 0.2732523148148148 | 50.021 |
| 0.2732638888888889 | 50.018 |
| 0.27327546296296296 | 50.018 |
| 0.27328703703703705 | 50.017 |
| 0.2732986111111111 | 50.016 |
| 0.2733101851851852 | 50.016 |
| 0.2733217592592592 | 50.016 |
| 0.2733333333333334 | 50.016 |
| 0.2733449074074074 | 50.017 |
| 0.27335648148148145 | 50.018 |
| 0.27336805555555554 | 50.021 |
| 0.27337962962962964 | 50.019 |
| 0.2733912037037037 | 50.021 |
| 0.2734027777777778 | 50.021 |
| 0.27341435185185187 | 50.022 |
| 0.2734259259259259 | 50.025 |
| 0.2734375 | 50.028 |
| 0.2734490740740741 | 50.027 |
| 0.27346064814814813 | 50.03 |
| 0.2734722222222222 | 50.035 |
| 0.2734837962962963 | 50.034 |
| 0.27349537037037036 | 50.033 |
| 0.27350694444444446 | 50.034 |
| 0.27351851851851855 | 50.032 |
| 0.2735300925925926 | 50.031 |
| 0.2735416666666666 | 50.032 |
| 0.2735532407407408 | 50.03 |
| 0.2735648148148148 | 50.028 |
| 0.2735763888888889 | 50.027 |
| 0.27358796296296295 | 50.028 |
| 0.27359953703703704 | 50.028 |